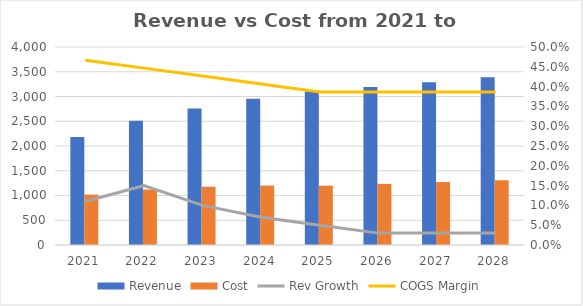
| Category | Revenue | Cost |
|---|---|---|
| 2021.0 | 2181.13 | 1017.861 |
| 2022.0 | 2508.3 | 1120.374 |
| 2023.0 | 2759.13 | 1177.229 |
| 2024.0 | 2952.269 | 1200.589 |
| 2025.0 | 3099.882 | 1198.621 |
| 2026.0 | 3192.879 | 1234.58 |
| 2027.0 | 3288.665 | 1271.617 |
| 2028.0 | 3387.325 | 1309.766 |